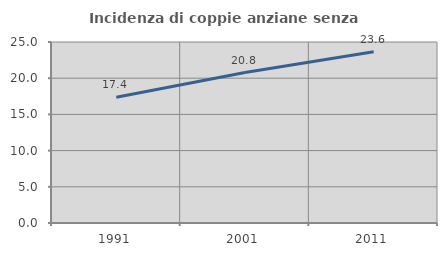
| Category | Incidenza di coppie anziane senza figli  |
|---|---|
| 1991.0 | 17.361 |
| 2001.0 | 20.774 |
| 2011.0 | 23.64 |